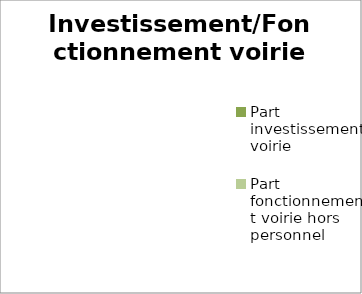
| Category | Series 0 |
|---|---|
| Part investissement voirie | 0 |
| Part fonctionnement voirie hors personnel | 0 |